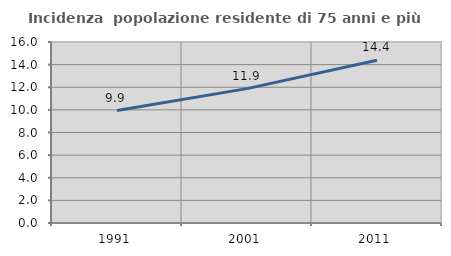
| Category | Incidenza  popolazione residente di 75 anni e più |
|---|---|
| 1991.0 | 9.942 |
| 2001.0 | 11.878 |
| 2011.0 | 14.386 |